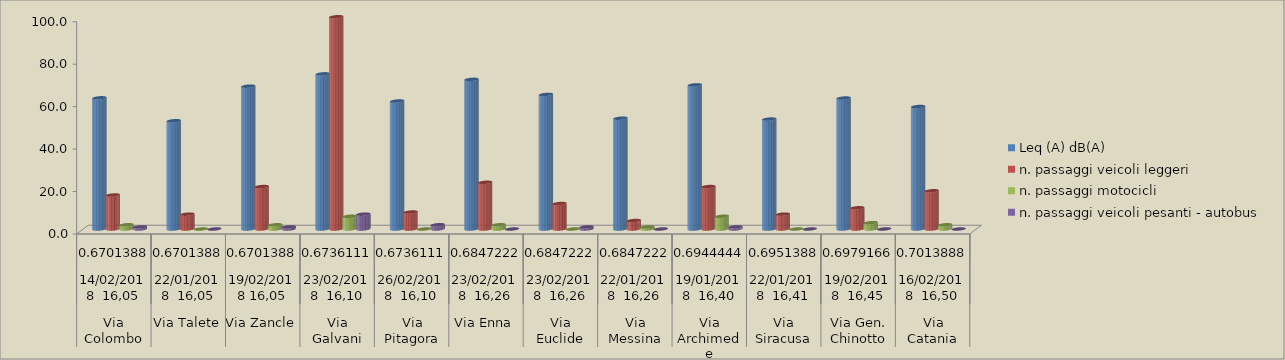
| Category | Leq (A) dB(A) | n. passaggi veicoli leggeri  | n. passaggi motocicli | n. passaggi veicoli pesanti - autobus  |
|---|---|---|---|---|
| 0 | 61.8 | 16 | 2 | 1 |
| 1 | 51 | 7 | 0 | 0 |
| 2 | 67.3 | 20 | 2 | 1 |
| 3 | 73.1 | 100 | 6 | 7 |
| 4 | 60.3 | 8 | 0 | 2 |
| 5 | 70.5 | 22 | 2 | 0 |
| 6 | 63.4 | 12 | 0 | 1 |
| 7 | 52.2 | 4 | 1 | 0 |
| 8 | 67.9 | 20 | 6 | 1 |
| 9 | 51.8 | 7 | 0 | 0 |
| 10 | 61.7 | 10 | 3 | 0 |
| 11 | 57.7 | 18 | 2 | 0 |